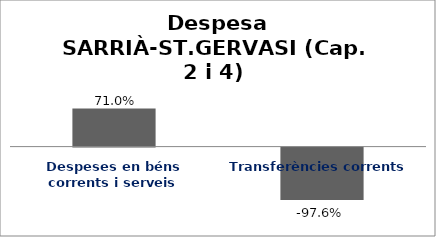
| Category | Series 0 |
|---|---|
| Despeses en béns corrents i serveis | 0.71 |
| Transferències corrents | -0.976 |